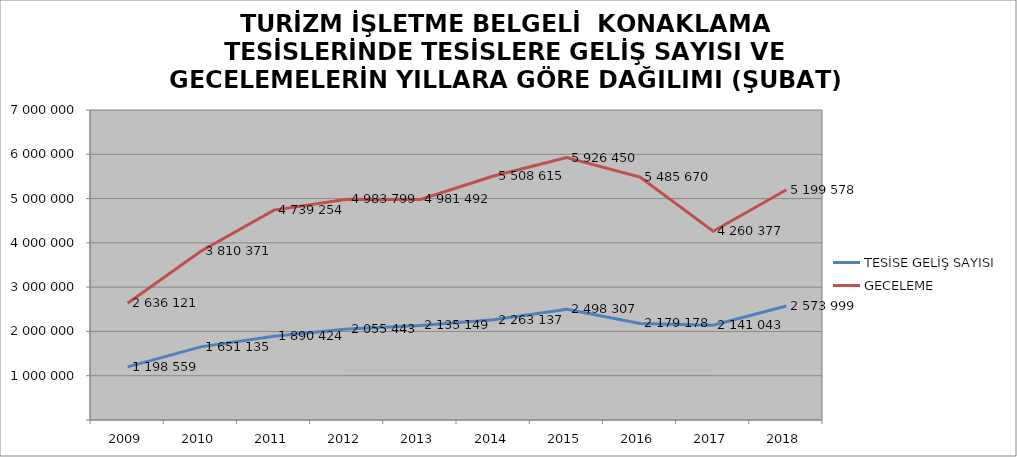
| Category | TESİSE GELİŞ SAYISI | GECELEME |
|---|---|---|
| 2009 | 1198559 | 2636121 |
| 2010 | 1651135 | 3810371 |
| 2011 | 1890424 | 4739254 |
| 2012 | 2055443 | 4983799 |
| 2013 | 2135149 | 4981492 |
| 2014 | 2263137 | 5508615 |
| 2015 | 2498307 | 5926450 |
| 2016 | 2179178 | 5485670 |
| 2017 | 2141043 | 4260377 |
| 2018 | 2573999 | 5199578 |